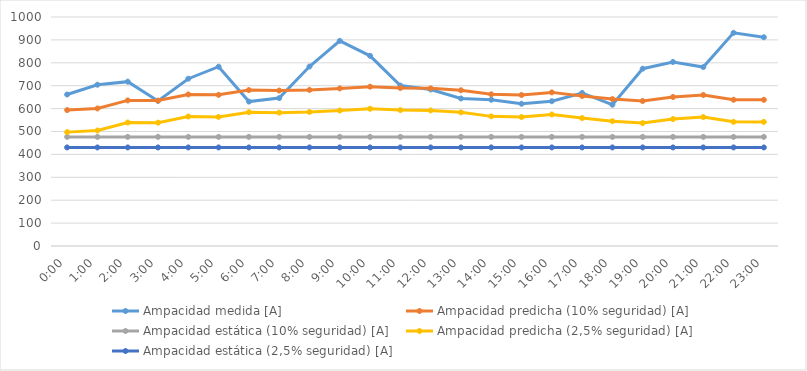
| Category | Ampacidad medida [A] | Ampacidad predicha (10% seguridad) [A] | Ampacidad estática (10% seguridad) [A] | Ampacidad predicha (2,5% seguridad) [A] | Ampacidad estática (2,5% seguridad) [A] |
|---|---|---|---|---|---|
| 0.0 | 661.565 | 593.698 | 476.5 | 497.265 | 430.4 |
| 0.041666666666666664 | 704.316 | 600.628 | 476.5 | 504.194 | 430.4 |
| 0.08333333333333333 | 717.635 | 635.743 | 476.5 | 539.309 | 430.4 |
| 0.125 | 633.605 | 635.017 | 476.5 | 538.584 | 430.4 |
| 0.166666666666667 | 730.561 | 661.887 | 476.5 | 565.453 | 430.4 |
| 0.208333333333333 | 783.059 | 660.109 | 476.5 | 563.675 | 430.4 |
| 0.25 | 630.691 | 680.89 | 476.5 | 584.456 | 430.4 |
| 0.291666666666667 | 645.88 | 678.723 | 476.5 | 582.289 | 430.4 |
| 0.333333333333333 | 783.603 | 681.753 | 476.5 | 585.319 | 430.4 |
| 0.375 | 895.771 | 688.1 | 476.5 | 591.666 | 430.4 |
| 0.416666666666667 | 830.512 | 695.708 | 476.5 | 599.275 | 430.4 |
| 0.458333333333333 | 700.652 | 689.949 | 476.5 | 593.515 | 430.4 |
| 0.5 | 683.582 | 688.402 | 476.5 | 591.969 | 430.4 |
| 0.541666666666667 | 644.235 | 679.995 | 476.5 | 583.561 | 430.4 |
| 0.583333333333333 | 638.782 | 662.518 | 476.5 | 566.084 | 430.4 |
| 0.625 | 621.135 | 659.493 | 476.5 | 563.06 | 430.4 |
| 0.666666666666667 | 632.339 | 670.807 | 476.5 | 574.373 | 430.4 |
| 0.708333333333333 | 668.289 | 655.079 | 476.5 | 558.645 | 430.4 |
| 0.75 | 616.964 | 641.49 | 476.5 | 545.056 | 430.4 |
| 0.791666666666667 | 774.287 | 633.167 | 476.5 | 536.734 | 430.4 |
| 0.833333333333333 | 803.602 | 650.688 | 476.5 | 554.254 | 430.4 |
| 0.875 | 781.337 | 659.282 | 476.5 | 562.848 | 430.4 |
| 0.916666666666667 | 930.965 | 638.642 | 476.5 | 542.209 | 430.4 |
| 0.958333333333333 | 911.605 | 638.366 | 476.5 | 541.932 | 430.4 |